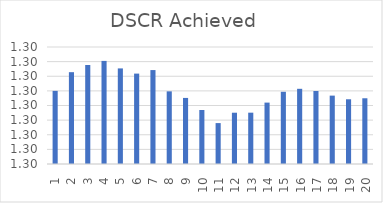
| Category | DSCR Achieved |
|---|---|
| 1.0 | 1.3 |
| 2.0 | 1.3 |
| 3.0 | 1.3 |
| 4.0 | 1.3 |
| 5.0 | 1.3 |
| 6.0 | 1.3 |
| 7.0 | 1.3 |
| 8.0 | 1.3 |
| 9.0 | 1.3 |
| 10.0 | 1.3 |
| 11.0 | 1.3 |
| 12.0 | 1.3 |
| 13.0 | 1.3 |
| 14.0 | 1.3 |
| 15.0 | 1.3 |
| 16.0 | 1.3 |
| 17.0 | 1.3 |
| 18.0 | 1.3 |
| 19.0 | 1.3 |
| 20.0 | 1.3 |